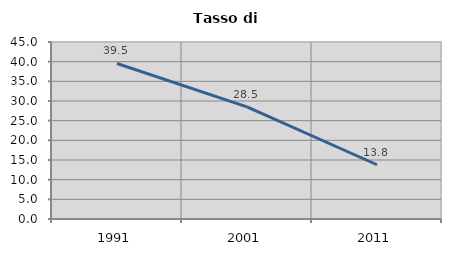
| Category | Tasso di disoccupazione   |
|---|---|
| 1991.0 | 39.543 |
| 2001.0 | 28.497 |
| 2011.0 | 13.793 |